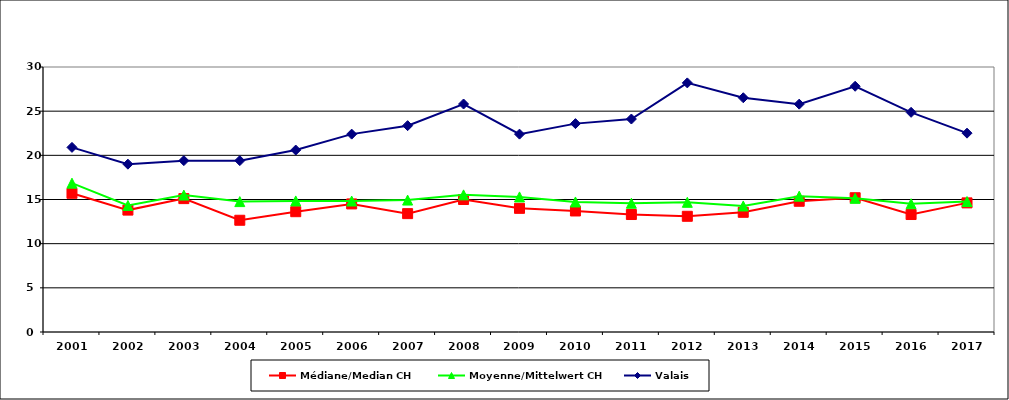
| Category | Médiane/Median CH | Moyenne/Mittelwert CH | Valais |
|---|---|---|---|
| 2001.0 | 15.7 | 16.85 | 20.9 |
| 2002.0 | 13.8 | 14.325 | 19 |
| 2003.0 | 15.1 | 15.5 | 19.4 |
| 2004.0 | 12.65 | 14.763 | 19.4 |
| 2005.0 | 13.62 | 14.838 | 20.6 |
| 2006.0 | 14.5 | 14.827 | 22.4 |
| 2007.0 | 13.4 | 14.936 | 23.36 |
| 2008.0 | 15 | 15.524 | 25.81 |
| 2009.0 | 14 | 15.293 | 22.4 |
| 2010.0 | 13.7 | 14.722 | 23.59 |
| 2011.0 | 13.3 | 14.574 | 24.11 |
| 2012.0 | 13.1 | 14.682 | 28.2 |
| 2013.0 | 13.55 | 14.269 | 26.52 |
| 2014.0 | 14.8 | 15.38 | 25.795 |
| 2015.0 | 15.2 | 15.136 | 27.82 |
| 2016.0 | 13.3 | 14.519 | 24.87 |
| 2017.0 | 14.617 | 14.771 | 22.51 |